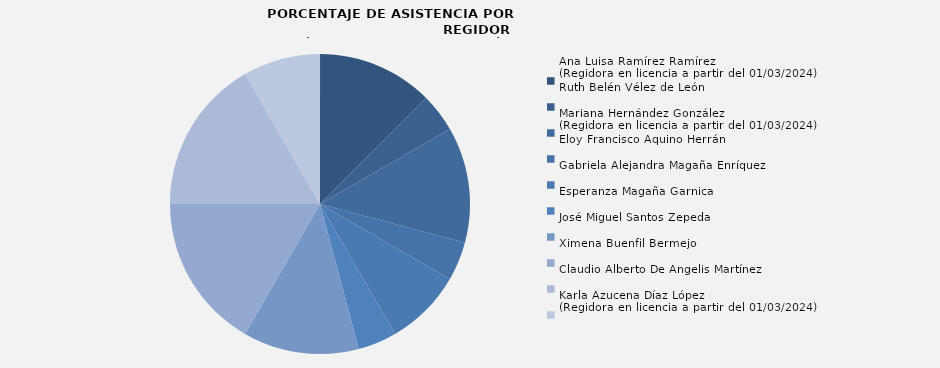
| Category | Ana Luisa Ramírez Ramírez
(Regidora en licencia a partir del 01/03/2024) |
|---|---|
| Ana Luisa Ramírez Ramírez
(Regidora en licencia a partir del 01/03/2024) | 75 |
| Ruth Belén Vélez de León | 25 |
| Mariana Hernández González 
(Regidora en licencia a partir del 01/03/2024) | 75 |
| Eloy Francisco Aquino Herrán | 25 |
| Gabriela Alejandra Magaña Enríquez | 50 |
| Esperanza Magaña Garnica | 25 |
| José Miguel Santos Zepeda | 75 |
| Ximena Buenfil Bermejo | 100 |
| Claudio Alberto De Angelis Martínez | 100 |
| Karla Azucena Díaz López
(Regidora en licencia a partir del 01/03/2024) | 50 |
| Juan Carlos Pérez Ayala | 0 |